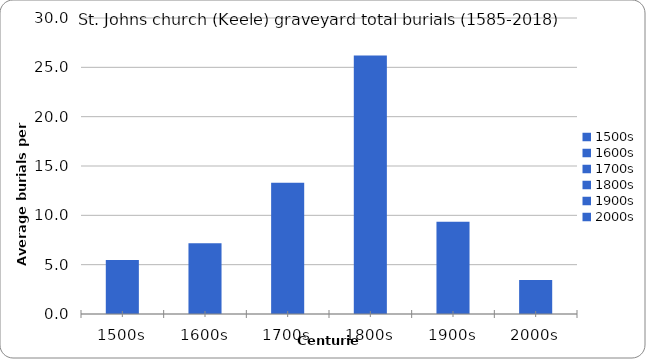
| Category | Series 0 |
|---|---|
| 1500s | 5.467 |
| 1600s | 7.162 |
| 1700s | 13.29 |
| 1800s | 26.19 |
| 1900s | 9.34 |
| 2000s | 3.444 |